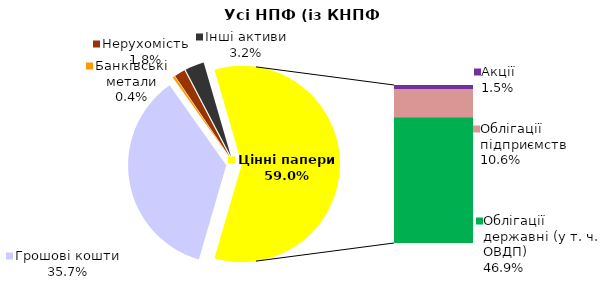
| Category | Усі НПФ (із КНПФ НБУ)* |
|---|---|
| Грошові кошти | 905.4 |
| Банківські метали | 9.1 |
| Нерухомість | 45.2 |
| Інші активи | 80.2 |
| Акції | 37.3 |
| Облігації підприємств | 268.8 |
| Муніципальні облігації | 0 |
| Облігації державні (у т. ч. ОВДП) | 1190.7 |